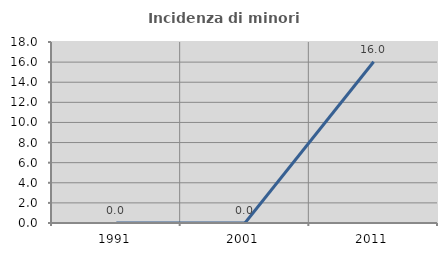
| Category | Incidenza di minori stranieri |
|---|---|
| 1991.0 | 0 |
| 2001.0 | 0 |
| 2011.0 | 16.038 |